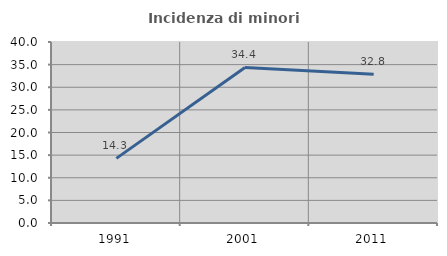
| Category | Incidenza di minori stranieri |
|---|---|
| 1991.0 | 14.286 |
| 2001.0 | 34.375 |
| 2011.0 | 32.847 |